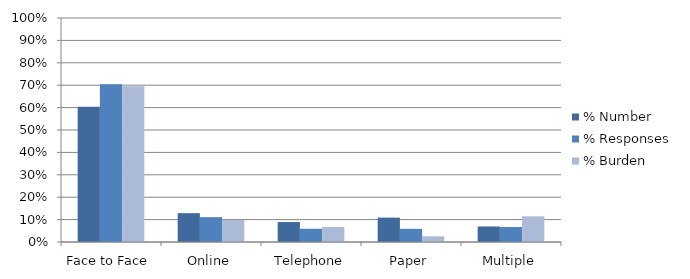
| Category | % Number | % Responses | % Burden |
|---|---|---|---|
| Face to Face | 0.604 | 0.704 | 0.695 |
| Online | 0.129 | 0.111 | 0.098 |
| Telephone | 0.089 | 0.059 | 0.067 |
| Paper | 0.109 | 0.059 | 0.025 |
| Multiple | 0.069 | 0.067 | 0.115 |